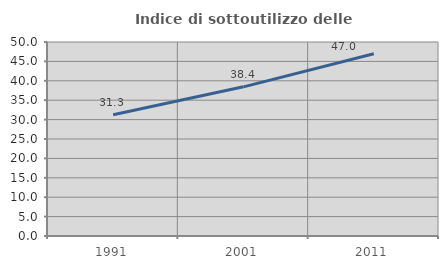
| Category | Indice di sottoutilizzo delle abitazioni  |
|---|---|
| 1991.0 | 31.255 |
| 2001.0 | 38.445 |
| 2011.0 | 46.953 |